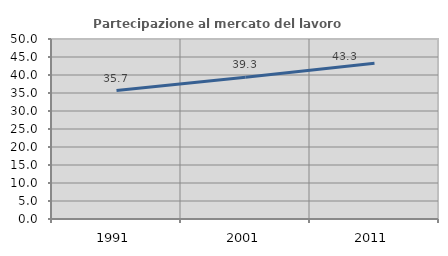
| Category | Partecipazione al mercato del lavoro  femminile |
|---|---|
| 1991.0 | 35.678 |
| 2001.0 | 39.346 |
| 2011.0 | 43.274 |